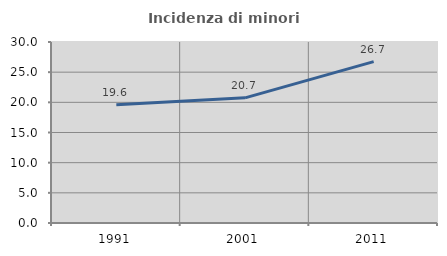
| Category | Incidenza di minori stranieri |
|---|---|
| 1991.0 | 19.608 |
| 2001.0 | 20.741 |
| 2011.0 | 26.744 |